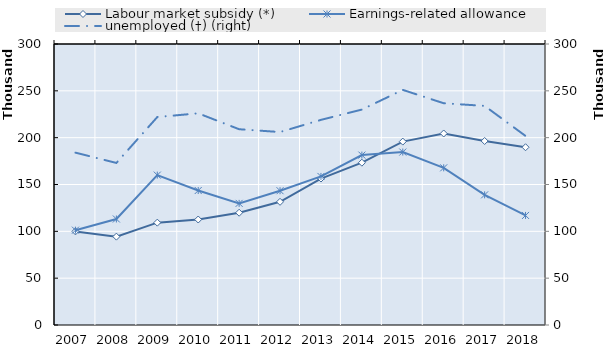
| Category | 0 | Series 14 | Series 15 | Series 16 | Series 17 | Series 18 | Series 19 | Labour market subsidy (*) | Earnings-related allowance |
|---|---|---|---|---|---|---|---|---|---|
| 2007.0 |  |  |  |  |  |  |  | 99944 | 101226 |
| 2008.0 |  |  |  |  |  |  |  | 94346 | 113173 |
| 2009.0 |  |  |  |  |  |  |  | 109280 | 160024 |
| 2010.0 |  |  |  |  |  |  |  | 112626 | 143565 |
| 2011.0 |  |  |  |  |  |  |  | 119861 | 129865 |
| 2012.0 |  |  |  |  |  |  |  | 131511 | 143375 |
| 2013.0 |  |  |  |  |  |  |  | 156365 | 158615 |
| 2014.0 |  |  |  |  |  |  |  | 173284 | 181405 |
| 2015.0 |  |  |  |  |  |  |  | 195801 | 184632 |
| 2016.0 |  |  |  |  |  |  |  | 204459 | 167797 |
| 2017.0 |  |  |  |  |  |  |  | 196452 | 138946 |
| 2018.0 |  |  |  |  |  |  |  | 189780 | 116972 |